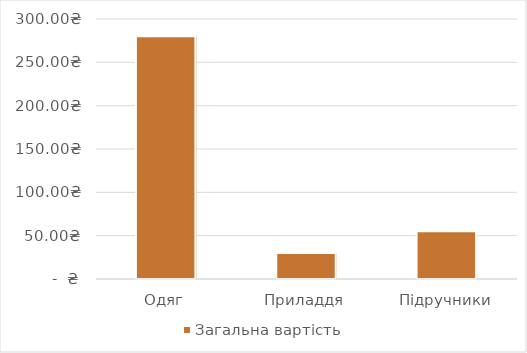
| Category | Загальна вартість |
|---|---|
| Одяг | 280 |
| Приладдя | 30 |
| Підручники | 55 |